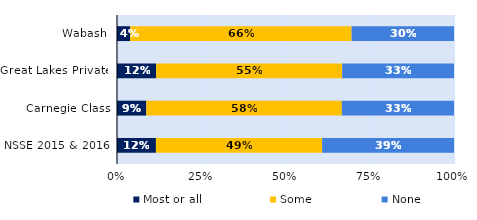
| Category | Most or all | Some | None |
|---|---|---|---|
| Wabash | 0.039 | 0.657 | 0.304 |
| Great Lakes Private | 0.116 | 0.552 | 0.332 |
| Carnegie Class | 0.087 | 0.58 | 0.333 |
| NSSE 2015 & 2016 | 0.116 | 0.493 | 0.391 |